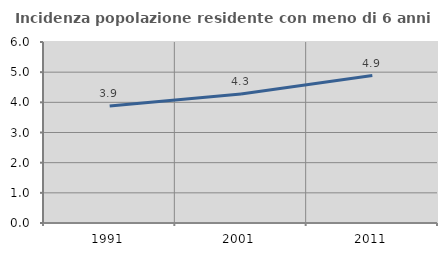
| Category | Incidenza popolazione residente con meno di 6 anni |
|---|---|
| 1991.0 | 3.88 |
| 2001.0 | 4.278 |
| 2011.0 | 4.888 |